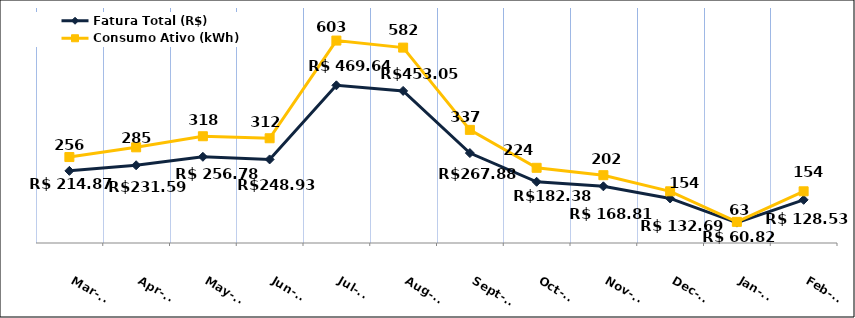
| Category | Fatura Total (R$) |
|---|---|
| 2023-03-01 | 214.87 |
| 2023-04-01 | 231.59 |
| 2023-05-01 | 256.78 |
| 2023-06-01 | 248.93 |
| 2023-07-01 | 469.64 |
| 2023-08-01 | 453.05 |
| 2023-09-01 | 267.88 |
| 2023-10-01 | 182.38 |
| 2023-11-01 | 168.81 |
| 2023-12-01 | 132.69 |
| 2024-01-01 | 60.82 |
| 2024-02-01 | 128.53 |